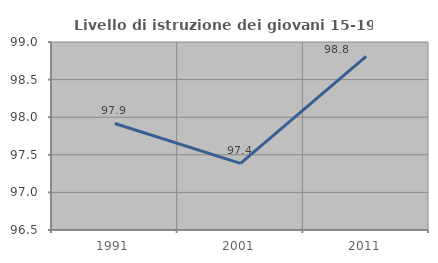
| Category | Livello di istruzione dei giovani 15-19 anni |
|---|---|
| 1991.0 | 97.917 |
| 2001.0 | 97.386 |
| 2011.0 | 98.81 |